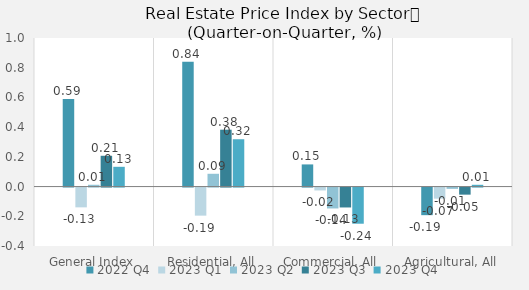
| Category | 2022 | 2023 |
|---|---|---|
| General Index | 0.589 | 0.133 |
| Residential, All | 0.839 | 0.319 |
| Commercial, All | 0.149 | -0.243 |
| Agricultural, All | -0.186 | 0.012 |